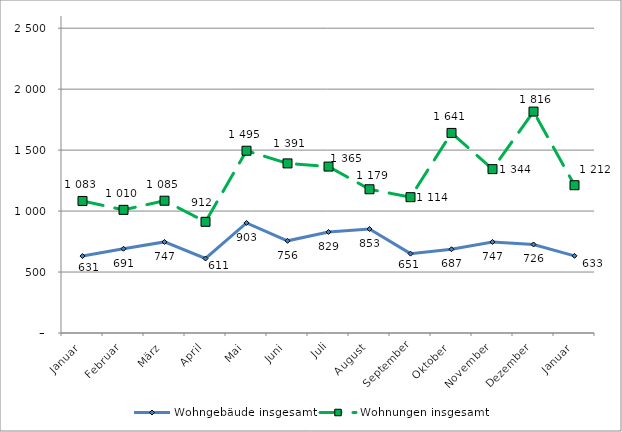
| Category | Wohngebäude insgesamt | Wohnungen insgesamt |
|---|---|---|
| Januar | 631 | 1083 |
| Februar | 691 | 1010 |
| März | 747 | 1085 |
| April | 611 | 912 |
| Mai | 903 | 1495 |
| Juni | 756 | 1391 |
| Juli | 829 | 1365 |
| August | 853 | 1179 |
| September | 651 | 1114 |
| Oktober | 687 | 1641 |
| November | 747 | 1344 |
| Dezember | 726 | 1816 |
| Januar | 633 | 1212 |